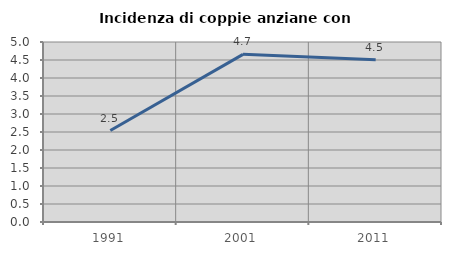
| Category | Incidenza di coppie anziane con figli |
|---|---|
| 1991.0 | 2.54 |
| 2001.0 | 4.657 |
| 2011.0 | 4.507 |